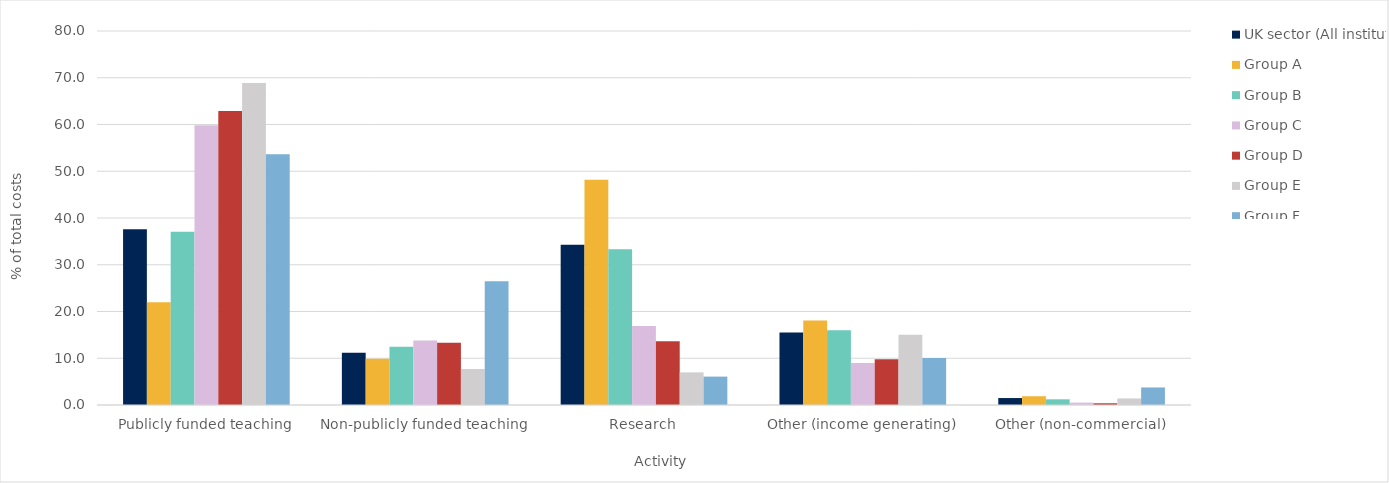
| Category | UK sector (All institutions) | Group A | Group B | Group C | Group D | Group E | Group F |
|---|---|---|---|---|---|---|---|
| 0 | 37.595 | 21.985 | 37.078 | 59.822 | 62.871 | 68.887 | 53.634 |
| 1 | 11.159 | 9.893 | 12.44 | 13.779 | 13.325 | 7.703 | 26.496 |
| 2 | 34.275 | 48.185 | 33.292 | 16.893 | 13.659 | 6.978 | 6.073 |
| 3 | 15.484 | 18.062 | 15.972 | 8.997 | 9.774 | 15.031 | 10.043 |
| 4 | 1.487 | 1.875 | 1.218 | 0.51 | 0.371 | 1.401 | 3.754 |